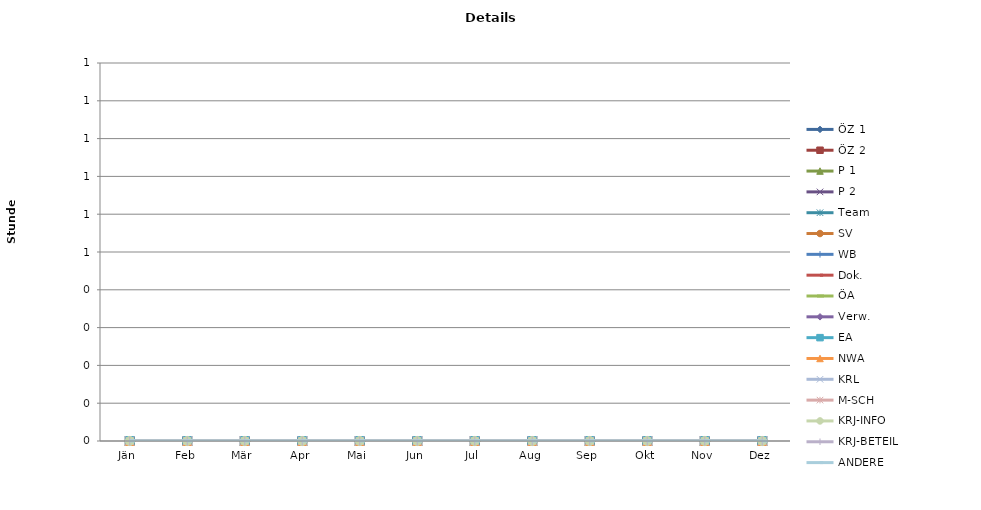
| Category | ÖZ 1 | ÖZ 2 | P 1 | P 2 | Team | SV | WB | Dok. | ÖA | Verw. | EA | NWA | KRL | M-SCH | KRJ-INFO | KRJ-BETEIL | ANDERE |
|---|---|---|---|---|---|---|---|---|---|---|---|---|---|---|---|---|---|
| Jän | 0 | 0 | 0 | 0 | 0 | 0 | 0 | 0 | 0 | 0 | 0 | 0 | 0 | 0 | 0 | 0 | 0 |
| Feb | 0 | 0 | 0 | 0 | 0 | 0 | 0 | 0 | 0 | 0 | 0 | 0 | 0 | 0 | 0 | 0 | 0 |
| Mär | 0 | 0 | 0 | 0 | 0 | 0 | 0 | 0 | 0 | 0 | 0 | 0 | 0 | 0 | 0 | 0 | 0 |
| Apr | 0 | 0 | 0 | 0 | 0 | 0 | 0 | 0 | 0 | 0 | 0 | 0 | 0 | 0 | 0 | 0 | 0 |
| Mai | 0 | 0 | 0 | 0 | 0 | 0 | 0 | 0 | 0 | 0 | 0 | 0 | 0 | 0 | 0 | 0 | 0 |
| Jun | 0 | 0 | 0 | 0 | 0 | 0 | 0 | 0 | 0 | 0 | 0 | 0 | 0 | 0 | 0 | 0 | 0 |
| Jul | 0 | 0 | 0 | 0 | 0 | 0 | 0 | 0 | 0 | 0 | 0 | 0 | 0 | 0 | 0 | 0 | 0 |
| Aug | 0 | 0 | 0 | 0 | 0 | 0 | 0 | 0 | 0 | 0 | 0 | 0 | 0 | 0 | 0 | 0 | 0 |
| Sep | 0 | 0 | 0 | 0 | 0 | 0 | 0 | 0 | 0 | 0 | 0 | 0 | 0 | 0 | 0 | 0 | 0 |
| Okt | 0 | 0 | 0 | 0 | 0 | 0 | 0 | 0 | 0 | 0 | 0 | 0 | 0 | 0 | 0 | 0 | 0 |
| Nov | 0 | 0 | 0 | 0 | 0 | 0 | 0 | 0 | 0 | 0 | 0 | 0 | 0 | 0 | 0 | 0 | 0 |
| Dez | 0 | 0 | 0 | 0 | 0 | 0 | 0 | 0 | 0 | 0 | 0 | 0 | 0 | 0 | 0 | 0 | 0 |